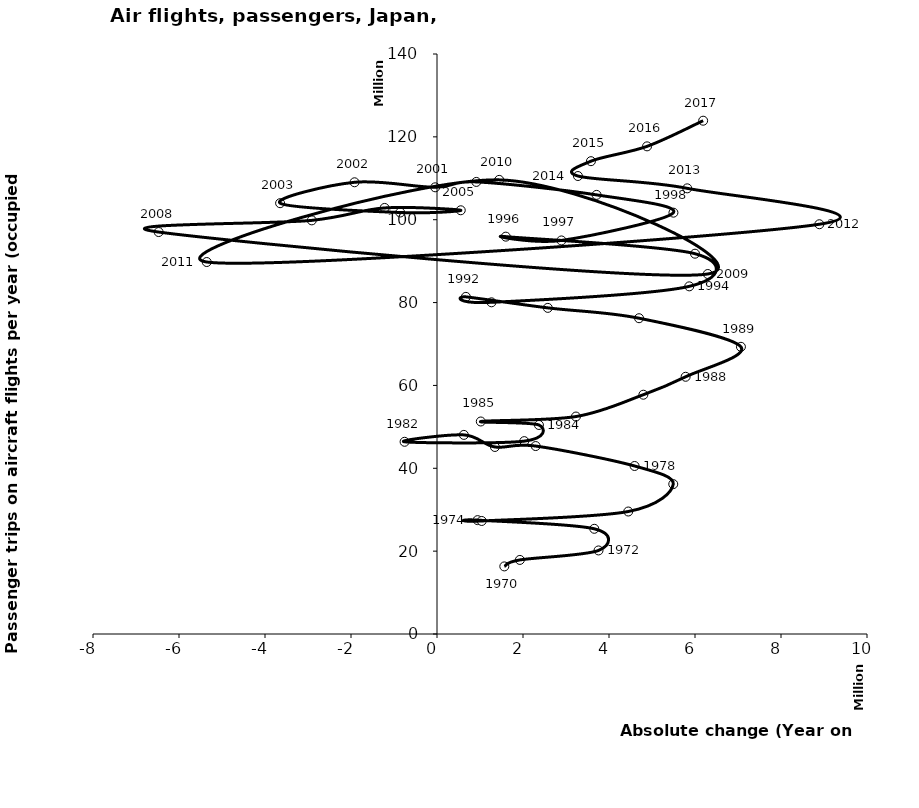
| Category | Series 0 |
|---|---|
| 1565400.0 | 16315100 |
| 1927200.0 | 17880500 |
| 3756300.0 | 20169500 |
| 3658100.0 | 25393100 |
| 944150.0 | 27485700 |
| 1040150.0 | 27281400 |
| 4448000.0 | 29566000 |
| 5494350.0 | 36177400 |
| 4595200.0 | 40554700 |
| 2294900.0 | 45367800 |
| 1346700.0 | 45144500 |
| 624850.0 | 48061200 |
| -753600.0 | 46394200 |
| 2029300.0 | 46554000 |
| 2370350.0 | 50452800 |
| 1018500.0 | 51294700 |
| 3231500.0 | 52489800 |
| 4798850.0 | 57757700 |
| 5781998.0 | 62087500 |
| 7068150.0 | 69321696 |
| 4699052.0 | 76223800 |
| 2577300.0 | 78719800 |
| 672052.0 | 81378400 |
| 1267552.0 | 80063904 |
| 5866548.0 | 83913504 |
| 6000000.0 | 91797000 |
| 1600300.0 | 95913504 |
| 2893848.0 | 94997600 |
| 5498448.0 | 101701200 |
| 3711056.0 | 105994496 |
| 914486.5 | 109123312 |
| -42735.5 | 107823469 |
| -1917461.0 | 109037841 |
| -3648620.5 | 103988547 |
| -854766.0 | 101740600 |
| 552359.5 | 102279015 |
| -1218338.5 | 102845319 |
| -2911424.0 | 99842338 |
| -6472905.5 | 97022471 |
| 6297274.982873999 | 86896527 |
| 1446145.5 | 109617020.966 |
| -5354580.982873999 | 89788818 |
| 8892091.0 | 98907859 |
| 5819570.5 | 107573000 |
| 3277500.0 | 110547000 |
| 3580500.0 | 114128000 |
| 4885000.0 | 117708000 |
| 6189500.0 | 123898000 |